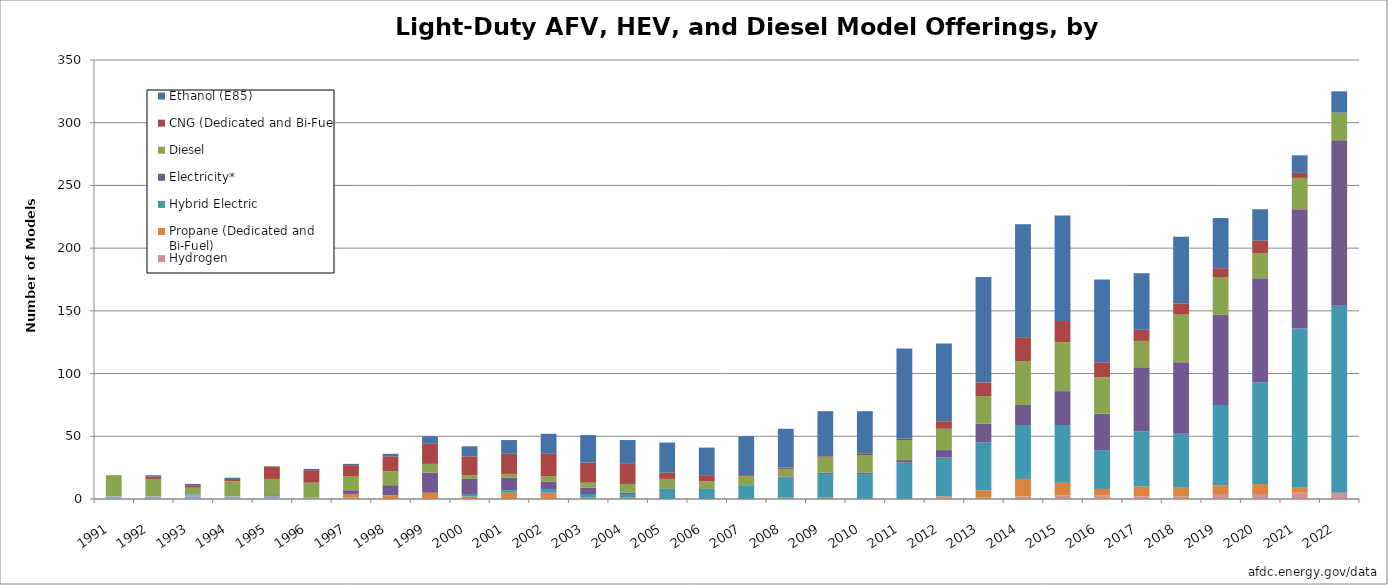
| Category | Methanol (M85) | Hydrogen | Propane (Dedicated and Bi-Fuel) | Hybrid Electric | Electricity* | Diesel | CNG (Dedicated and Bi-Fuel) | Ethanol (E85) |
|---|---|---|---|---|---|---|---|---|
| 1991.0 | 2 | 0 | 0 | 0 | 0 | 17 | 0 | 0 |
| 1992.0 | 2 | 0 | 0 | 0 | 0 | 14 | 2 | 1 |
| 1993.0 | 4 | 0 | 0 | 0 | 0 | 5 | 2 | 1 |
| 1994.0 | 2 | 0 | 0 | 0 | 0 | 12 | 2 | 1 |
| 1995.0 | 2 | 0 | 0 | 0 | 1 | 13 | 10 | 0 |
| 1996.0 | 1 | 0 | 0 | 0 | 0 | 12 | 10 | 1 |
| 1997.0 | 1 | 0 | 3 | 0 | 3 | 11 | 9 | 1 |
| 1998.0 | 0 | 0 | 3 | 0 | 8 | 11 | 12 | 2 |
| 1999.0 | 0 | 0 | 5 | 0 | 16 | 7 | 16 | 6 |
| 2000.0 | 0 | 0 | 2 | 2 | 12 | 3 | 15 | 8 |
| 2001.0 | 0 | 0 | 5 | 2 | 10 | 3 | 16 | 11 |
| 2002.0 | 0 | 0 | 5 | 3 | 6 | 4 | 18 | 16 |
| 2003.0 | 0 | 0 | 1 | 3 | 5 | 4 | 16 | 22 |
| 2004.0 | 0 | 0 | 1 | 3 | 1 | 7 | 16 | 19 |
| 2005.0 | 0 | 0 | 0 | 8 | 0 | 8 | 5 | 24 |
| 2006.0 | 0 | 0 | 0 | 8 | 0 | 6 | 5 | 22 |
| 2007.0 | 0 | 0 | 0 | 11 | 0 | 7 | 1 | 31 |
| 2008.0 | 0 | 0 | 1 | 16 | 1 | 6 | 1 | 31 |
| 2009.0 | 0 | 0 | 1 | 19 | 1 | 12 | 1 | 36 |
| 2010.0 | 0 | 0 | 0 | 20 | 1 | 14 | 1 | 34 |
| 2011.0 | 0 | 0 | 0 | 29 | 2 | 16 | 1 | 72 |
| 2012.0 | 0 | 1 | 1 | 31 | 6 | 17 | 6 | 62 |
| 2013.0 | 0 | 1 | 6 | 38 | 15 | 22 | 11 | 84 |
| 2014.0 | 0 | 2 | 14 | 43 | 16 | 35 | 19 | 90 |
| 2015.0 | 0 | 3 | 10 | 46 | 27 | 39 | 17 | 84 |
| 2016.0 | 0 | 3 | 5 | 31 | 29 | 29 | 12 | 66 |
| 2017.0 | 0 | 2 | 8 | 44 | 51 | 21 | 9 | 45 |
| 2018.0 | 0 | 2 | 7 | 43 | 57 | 38 | 9 | 53 |
| 2019.0 | 0 | 4 | 7 | 64 | 72 | 30 | 7 | 40 |
| 2020.0 | 0 | 4 | 8 | 81 | 83 | 20 | 10 | 25 |
| 2021.0 | 0 | 5 | 4 | 127 | 95 | 25 | 4 | 14 |
| 2022.0 | 0 | 5 | 0 | 149 | 132 | 22 | 0 | 17 |